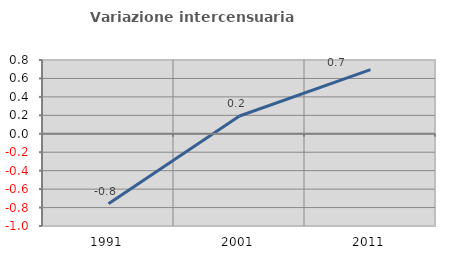
| Category | Variazione intercensuaria annua |
|---|---|
| 1991.0 | -0.758 |
| 2001.0 | 0.192 |
| 2011.0 | 0.695 |